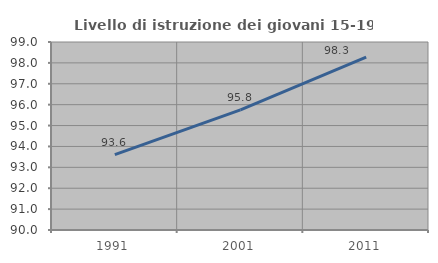
| Category | Livello di istruzione dei giovani 15-19 anni |
|---|---|
| 1991.0 | 93.606 |
| 2001.0 | 95.753 |
| 2011.0 | 98.276 |